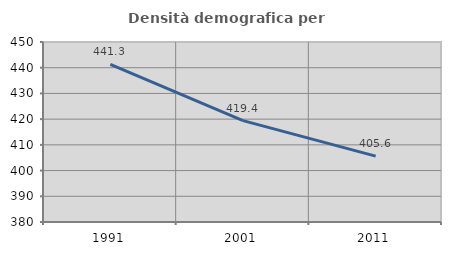
| Category | Densità demografica |
|---|---|
| 1991.0 | 441.327 |
| 2001.0 | 419.407 |
| 2011.0 | 405.632 |